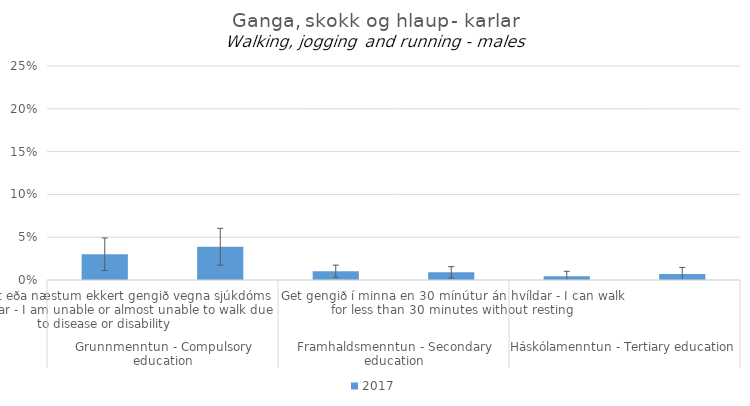
| Category | 2017 |
|---|---|
| 0 | 0.03 |
| 1 | 0.039 |
| 2 | 0.01 |
| 3 | 0.009 |
| 4 | 0.004 |
| 5 | 0.007 |